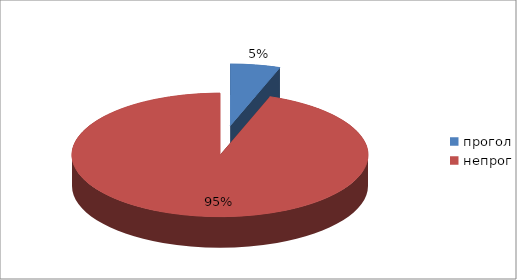
| Category | Series 0 |
|---|---|
| прогол | 18 |
| непрог | 312 |